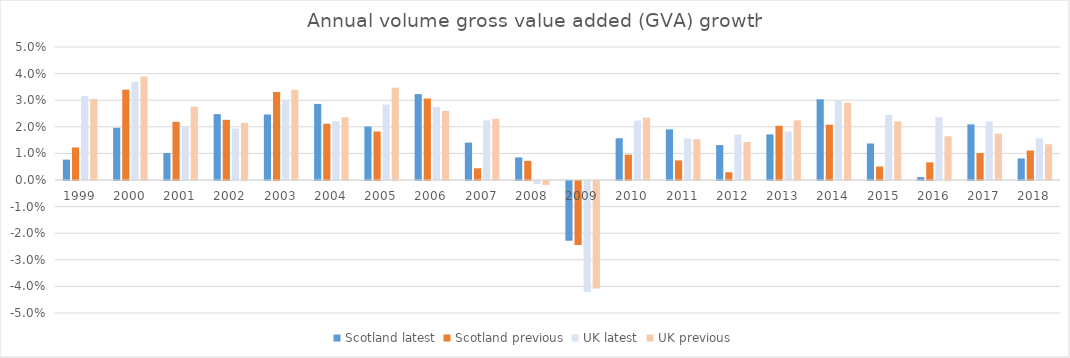
| Category | Scotland | UK |
|---|---|---|
| 1999.0 | 0.012 | 0.03 |
| 2000.0 | 0.034 | 0.039 |
| 2001.0 | 0.022 | 0.028 |
| 2002.0 | 0.023 | 0.021 |
| 2003.0 | 0.033 | 0.034 |
| 2004.0 | 0.021 | 0.024 |
| 2005.0 | 0.018 | 0.035 |
| 2006.0 | 0.031 | 0.026 |
| 2007.0 | 0.004 | 0.023 |
| 2008.0 | 0.007 | -0.001 |
| 2009.0 | -0.024 | -0.04 |
| 2010.0 | 0.01 | 0.023 |
| 2011.0 | 0.007 | 0.015 |
| 2012.0 | 0.003 | 0.014 |
| 2013.0 | 0.02 | 0.022 |
| 2014.0 | 0.021 | 0.029 |
| 2015.0 | 0.005 | 0.022 |
| 2016.0 | 0.007 | 0.016 |
| 2017.0 | 0.01 | 0.017 |
| 2018.0 | 0.011 | 0.013 |